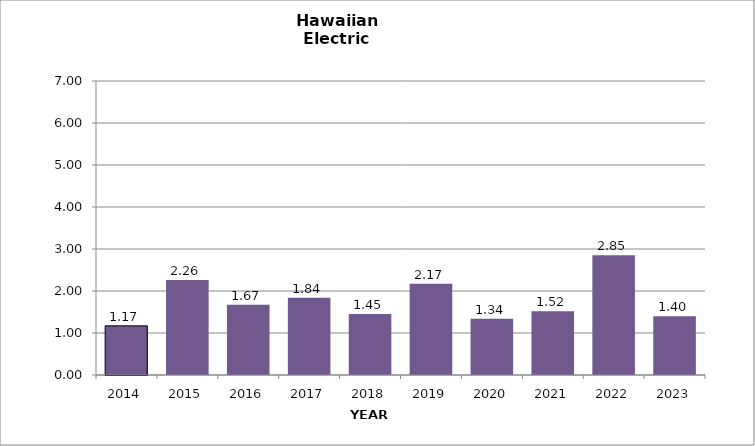
| Category | Hawaiian Electric |
|---|---|
| 2014.0 | 1.17 |
| 2015.0 | 2.26 |
| 2016.0 | 1.67 |
| 2017.0 | 1.84 |
| 2018.0 | 1.45 |
| 2019.0 | 2.17 |
| 2020.0 | 1.34 |
| 2021.0 | 1.52 |
| 2022.0 | 2.85 |
| 2023.0 | 1.4 |